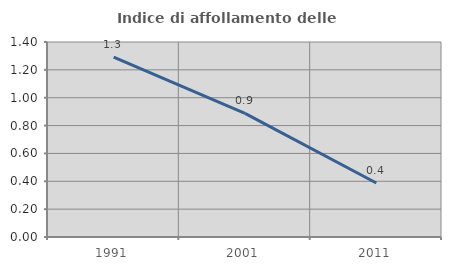
| Category | Indice di affollamento delle abitazioni  |
|---|---|
| 1991.0 | 1.291 |
| 2001.0 | 0.887 |
| 2011.0 | 0.388 |